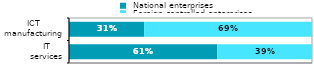
| Category |  National enterprises |  Foreign-controlled enterprises |
|---|---|---|
|  IT 
services | 0.61 | 0.39 |
|  ICT 
manufacturing | 0.309 | 0.691 |